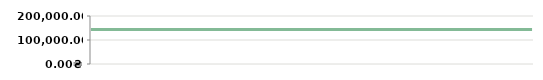
| Category | РІК  4 |
|---|---|
| 2013-04-23 | 143800 |
| 2013-04-25 | 143800 |
| 2013-05-07 | 143800 |
| 2013-05-14 | 143800 |
| 2013-05-14 | 143800 |
| 2013-05-29 | 143800 |
| 2013-06-10 | 143800 |
| 2013-06-21 | 143800 |
| 2013-07-06 | 143800 |
| 2013-08-05 | 143800 |
| 2013-08-19 | 143800 |
| 2013-09-04 | 143800 |
| 2013-09-20 | 143800 |
| 2013-09-25 | 143800 |
| 2013-10-15 | 143800 |
| 2013-11-05 | 143800 |
| 2013-11-26 | 143800 |
| 2013-11-30 | 143800 |
| 2013-12-11 | 143800 |